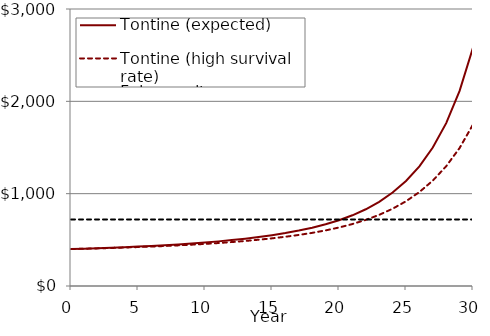
| Category | Tontine (expected) | Tontine (high survival rate) | Fair annuity |
|---|---|---|---|
| 0.0 | 400 | 400 | 720.738 |
| nan | 404.531 | 403.616 | 720.738 |
| nan | 409.495 | 407.569 | 720.738 |
| nan | 414.924 | 411.88 | 720.738 |
| nan | 420.834 | 416.561 | 720.738 |
| 5.0 | 427.267 | 421.639 | 720.738 |
| nan | 434.313 | 427.183 | 720.738 |
| nan | 442.095 | 433.285 | 720.738 |
| nan | 450.726 | 440.026 | 720.738 |
| nan | 460.341 | 447.503 | 720.738 |
| 10.0 | 471.104 | 455.834 | 720.738 |
| nan | 483.268 | 465.202 | 720.738 |
| nan | 497.097 | 475.791 | 720.738 |
| nan | 512.789 | 487.731 | 720.738 |
| nan | 530.535 | 501.141 | 720.738 |
| 15.0 | 550.637 | 516.218 | 720.738 |
| nan | 573.606 | 533.302 | 720.738 |
| nan | 600.166 | 552.875 | 720.738 |
| nan | 631.231 | 575.535 | 720.738 |
| nan | 668.044 | 602.077 | 720.738 |
| 20.0 | 712.204 | 633.501 | 720.738 |
| nan | 765.722 | 671.02 | 720.738 |
| nan | 831.141 | 716.113 | 720.738 |
| nan | 911.734 | 770.607 | 720.738 |
| nan | 1011.817 | 836.826 | 720.738 |
| 25.0 | 1137.23 | 917.798 | 720.738 |
| nan | 1296.035 | 1017.542 | 720.738 |
| nan | 1499.559 | 1141.482 | 720.738 |
| nan | 1764.02 | 1297.043 | 720.738 |
| nan | 2113.07 | 1494.547 | 720.738 |
| 30.0 | 2581.907 | 1748.557 | 720.738 |